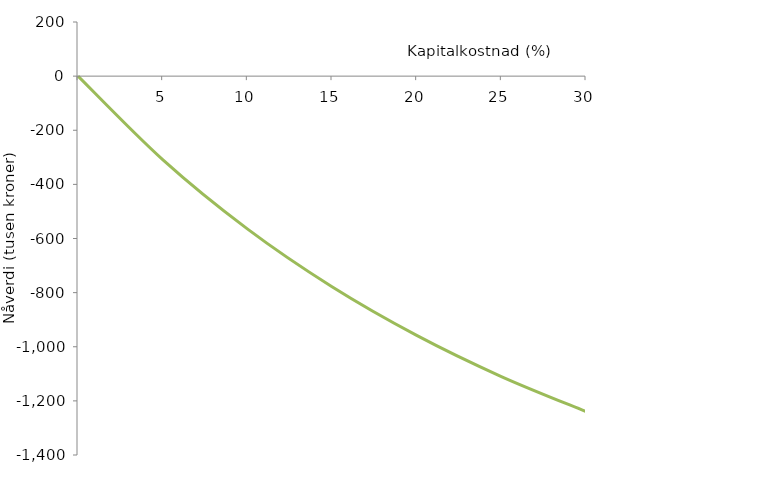
| Category | Differansekontantstrøm |
|---|---|
| nan | 0 |
| 5.0 | -308.647 |
| 10.0 | -564.53 |
| 15.000000000000002 | -778.254 |
| 20.0 | -957.963 |
| 25.0 | -1109.984 |
| 30.0 | -1239.285 |